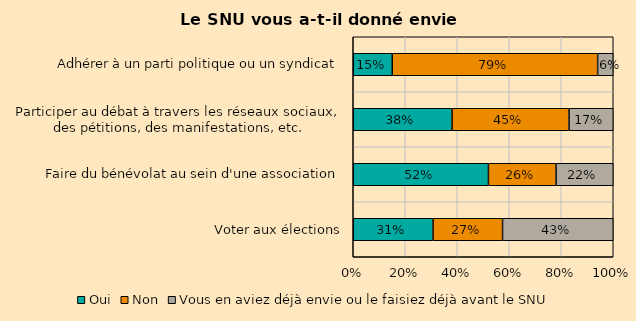
| Category | Oui | Non | Vous en aviez déjà envie ou le faisiez déjà avant le SNU |
|---|---|---|---|
| Voter aux élections | 0.31 | 0.27 | 0.43 |
| Faire du bénévolat au sein d'une association | 0.52 | 0.26 | 0.22 |
| Participer au débat à travers les réseaux sociaux, des pétitions, des manifestations, etc. | 0.38 | 0.45 | 0.17 |
| Adhérer à un parti politique ou un syndicat | 0.15 | 0.79 | 0.06 |